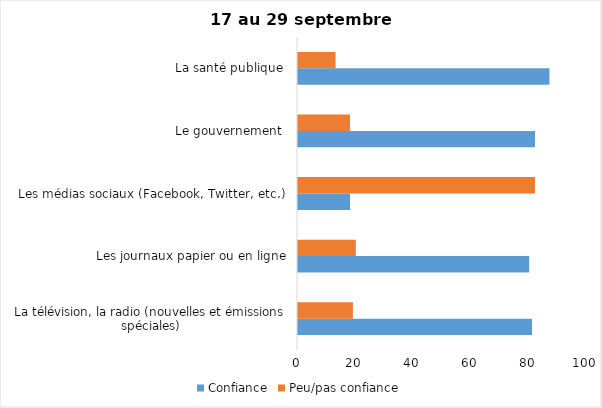
| Category | Confiance | Peu/pas confiance |
|---|---|---|
| La télévision, la radio (nouvelles et émissions spéciales) | 81 | 19 |
| Les journaux papier ou en ligne | 80 | 20 |
| Les médias sociaux (Facebook, Twitter, etc.) | 18 | 82 |
| Le gouvernement  | 82 | 18 |
| La santé publique  | 87 | 13 |